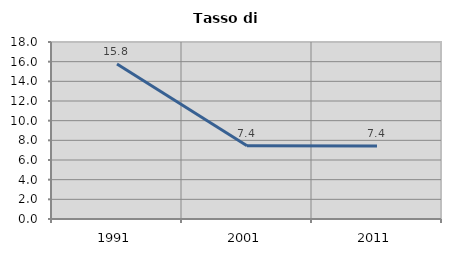
| Category | Tasso di disoccupazione   |
|---|---|
| 1991.0 | 15.757 |
| 2001.0 | 7.443 |
| 2011.0 | 7.418 |